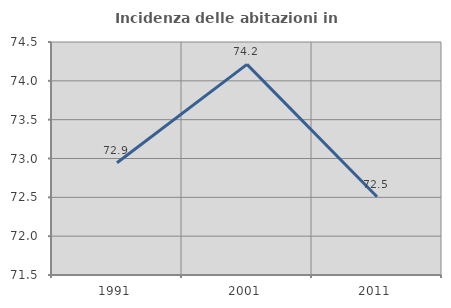
| Category | Incidenza delle abitazioni in proprietà  |
|---|---|
| 1991.0 | 72.945 |
| 2001.0 | 74.211 |
| 2011.0 | 72.508 |